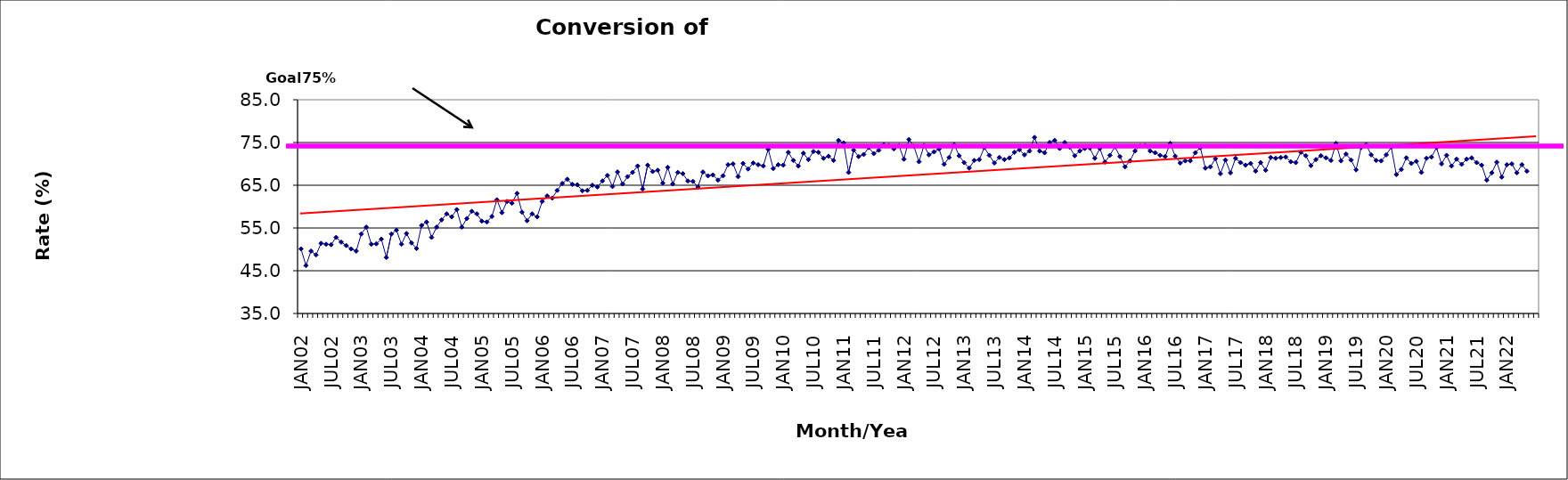
| Category | Series 0 |
|---|---|
| JAN02 | 50.1 |
| FEB02 | 46.2 |
| MAR02 | 49.6 |
| APR02 | 48.7 |
| MAY02 | 51.4 |
| JUN02 | 51.2 |
| JUL02 | 51.1 |
| AUG02 | 52.8 |
| SEP02 | 51.7 |
| OCT02 | 50.9 |
| NOV02 | 50.1 |
| DEC02 | 49.6 |
| JAN03 | 53.6 |
| FEB03 | 55.2 |
| MAR03 | 51.2 |
| APR03 | 51.3 |
| MAY03 | 52.4 |
| JUN03 | 48.1 |
| JUL03 | 53.6 |
| AUG03 | 54.5 |
| SEP03 | 51.2 |
| OCT03 | 53.7 |
| NOV03 | 51.5 |
| DEC03 | 50.2 |
| JAN04 | 55.6 |
| FEB04 | 56.4 |
| MAR04 | 52.8 |
| APR04 | 55.2 |
| MAY04 | 56.9 |
| JUN04 | 58.3 |
| JUL04 | 57.6 |
| AUG04 | 59.3 |
| SEP04 | 55.2 |
| OCT04 | 57.2 |
| NOV04 | 58.9 |
| DEC04 | 58.3 |
| JAN05 | 56.6 |
| FEB05 | 56.4 |
| MAR05 | 57.7 |
| APR05 | 61.6 |
| MAY05 | 58.6 |
| JUN05 | 61.2 |
| JUL05 | 60.8 |
| AUG05 | 63.1 |
| SEP05 | 58.7 |
| OCT05 | 56.7 |
| NOV05 | 58.3 |
| DEC05 | 57.6 |
| JAN06 | 61.2 |
| FEB06 | 62.5 |
| MAR06 | 62 |
| APR06 | 63.8 |
| MAY06 | 65.4 |
| JUN06 | 66.4 |
| JUL06 | 65.2 |
| AUG06 | 65.1 |
| SEP06 | 63.7 |
| OCT06 | 63.8 |
| NOV06 | 65 |
| DEC06 | 64.6 |
| JAN07 | 66 |
| FEB07 | 67.3 |
| MAR07 | 64.7 |
| APR07 | 68.1 |
| MAY07 | 65.3 |
| JUN07 | 67 |
| JUL07 | 68 |
| AUG07 | 69.5 |
| SEP07 | 64.1 |
| OCT07 | 69.7 |
| NOV07 | 68.2 |
| DEC07 | 68.5 |
| JAN08 | 65.5 |
| FEB08 | 69.2 |
| MAR08 | 65.3 |
| APR08 | 68 |
| MAY08 | 67.7 |
| JUN08 | 66 |
| JUL08 | 65.9 |
| AUG08 | 64.6 |
| SEP08 | 68.1 |
| OCT08 | 67.2 |
| NOV08 | 67.4 |
| DEC08 | 66.2 |
| JAN09 | 67.2 |
| FEB09 | 69.8 |
| MAR09 | 70 |
| APR09 | 67 |
| MAY09 | 70.1 |
| JUN09 | 68.8 |
| JUL09 | 70.2 |
| AUG09 | 69.8 |
| SEP09 | 69.5 |
| OCT09 | 73.4 |
| NOV09 | 68.9 |
| DEC09 | 69.8 |
| JAN10 | 69.7 |
| FEB10 | 72.7 |
| MAR10 | 70.8 |
| APR10 | 69.5 |
| MAY10 | 72.5 |
| JUN10 | 71 |
| JUL10 | 72.9 |
| AUG10 | 72.7 |
| SEP10 | 71.3 |
| OCT10 | 71.8 |
| NOV10 | 70.8 |
| DEC10 | 75.5 |
| JAN11 | 74.9 |
| FEB11 | 68 |
| MAR11 | 73.2 |
| APR11 | 71.7 |
| MAY11 | 72.2 |
| JUN11 | 73.8 |
| JUL11 | 72.4 |
| AUG11 | 73.2 |
| SEP11 | 74.5 |
| OCT11 | 74.3 |
| NOV11 | 73.5 |
| DEC11 | 74.3 |
| JAN12 | 71.1 |
| FEB12 | 75.7 |
| MAR12 | 74.1 |
| APR12 | 70.5 |
| MAY12 | 74.3 |
| JUN12 | 72.1 |
| JUL12 | 72.8 |
| AUG12 | 73.5 |
| SEP12 | 69.9 |
| OCT12 | 71.5 |
| NOV12 | 74.5 |
| DEC12 | 71.9 |
| JAN13 | 70.3 |
| FEB13 | 69 |
| MAR13 | 70.8 |
| APR13 | 71 |
| MAY13 | 73.8 |
| JUN13 | 72 |
| JUL13 | 70.2 |
| AUG13 | 71.5 |
| SEP13 | 71 |
| OCT13 | 71.4 |
| NOV13 | 72.7 |
| DEC13 | 73.3 |
| JAN14 | 72.1 |
| FEB14 | 73 |
| MAR14 | 76.2 |
| APR14 | 73 |
| MAY14 | 72.6 |
| JUN14 | 75 |
| JUL14 | 75.5 |
| AUG14 | 73.6 |
| SEP14 | 75 |
| OCT14 | 73.9 |
| NOV14 | 71.9 |
| DEC14 | 73 |
| JAN15 | 73.6 |
| FEB15 | 73.7 |
| MAR15 | 71.3 |
| APR15 | 73.6 |
| MAY15 | 70.4 |
| JUN15 | 72 |
| JUL15 | 74 |
| AUG15 | 71.7 |
| SEP15 | 69.3 |
| OCT15 | 70.7 |
| NOV15 | 73 |
| DEC15 | 74.2 |
| JAN16 | 74.3 |
| FEB16 | 73 |
| MAR16 | 72.6 |
| APR16 | 72 |
| MAY16 | 71.7 |
| JUN16 | 74.8 |
| JUL16 | 71.8 |
| AUG16 | 70.2 |
| SEP16 | 70.7 |
| OCT16 | 70.7 |
| NOV16 | 72.6 |
| DEC16 | 73.8 |
| JAN17 | 69 |
| FEB17 | 69.3 |
| MAR17 | 71.2 |
| APR17 | 67.7 |
| MAY17 | 70.9 |
| JUN17 | 67.9 |
| JUL17 | 71.3 |
| AUG17 | 70.3 |
| SEP17 | 69.7 |
| OCT17 | 70.1 |
| NOV17 | 68.3 |
| DEC17 | 70.3 |
| JAN18 | 68.5 |
| FEB18 | 71.5 |
| MAR18 | 71.3 |
| APR18 | 71.5 |
| MAY18 | 71.6 |
| JUN18 | 70.5 |
| JUL18 | 70.3 |
| AUG18 | 72.7 |
| SEP18 | 71.9 |
| OCT18 | 69.6 |
| NOV18 | 71 |
| DEC18 | 71.9 |
| JAN19 | 71.4 |
| FEB19 | 70.8 |
| MAR19 | 74.8 |
| APR19 | 70.7 |
| MAY19 | 72.3 |
| JUN19 | 70.9 |
| JUL19 | 68.6 |
| AUG19 | 73.8 |
| SEP19 | 74.5 |
| OCT19 | 72.1 |
| NOV19 | 70.8 |
| DEC19 | 70.7 |
| JAN20 | 72.1 |
| FEB20 | 73.9 |
| MAR20 | 67.5 |
| APR20 | 68.7 |
| MAY20 | 71.4 |
| JUN20 | 70.1 |
| JUL20 | 70.6 |
| AUG20 | 68 |
| SEP20 | 71.3 |
| OCT20 | 71.6 |
| NOV20 | 73.8 |
| DEC20 | 70 |
| JAN21 | 72 |
| FEB21 | 69.5 |
| MAR21 | 71.1 |
| APR21 | 69.9 |
| MAY21 | 71.1 |
| JUN21 | 71.4 |
| JUL21 | 70.3 |
| AUG21 | 69.7 |
| SEP21 | 66.2 |
| OCT21 | 67.9 |
| NOV21 | 70.4 |
| DEC21 | 66.9 |
| JAN22 | 69.8 |
| FEB22 | 70 |
| MAR22 | 67.9 |
| APR22 | 69.8 |
| MAY22 | 68.3 |